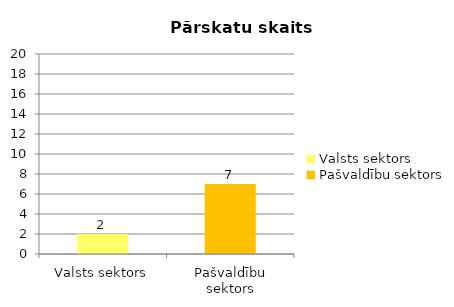
| Category |  Pārskatu skaits |
|---|---|
| Valsts sektors | 2 |
| Pašvaldību sektors | 7 |